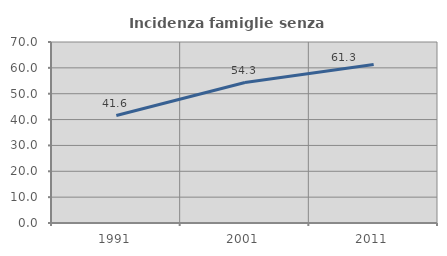
| Category | Incidenza famiglie senza nuclei |
|---|---|
| 1991.0 | 41.566 |
| 2001.0 | 54.31 |
| 2011.0 | 61.316 |